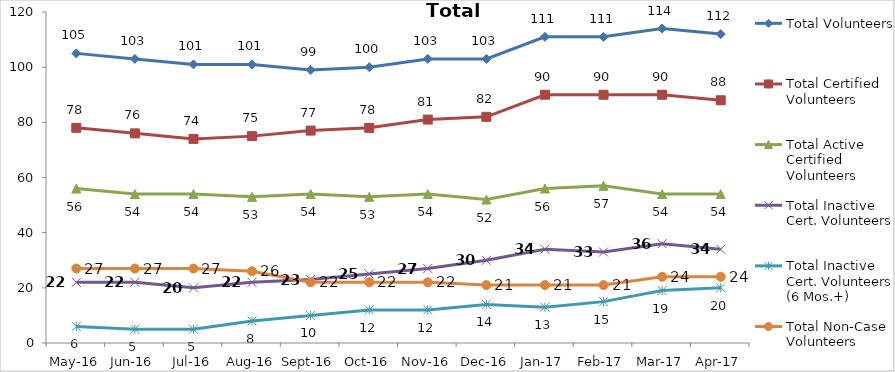
| Category | Total Volunteers | Total Certified Volunteers | Total Active Certified Volunteers | Total Inactive Cert. Volunteers | Total Inactive Cert. Volunteers (6 Mos.+) | Total Non-Case Volunteers |
|---|---|---|---|---|---|---|
| May-16 | 105 | 78 | 56 | 22 | 6 | 27 |
| Jun-16 | 103 | 76 | 54 | 22 | 5 | 27 |
| Jul-16 | 101 | 74 | 54 | 20 | 5 | 27 |
| Aug-16 | 101 | 75 | 53 | 22 | 8 | 26 |
| Sep-16 | 99 | 77 | 54 | 23 | 10 | 22 |
| Oct-16 | 100 | 78 | 53 | 25 | 12 | 22 |
| Nov-16 | 103 | 81 | 54 | 27 | 12 | 22 |
| Dec-16 | 103 | 82 | 52 | 30 | 14 | 21 |
| Jan-17 | 111 | 90 | 56 | 34 | 13 | 21 |
| Feb-17 | 111 | 90 | 57 | 33 | 15 | 21 |
| Mar-17 | 114 | 90 | 54 | 36 | 19 | 24 |
| Apr-17 | 112 | 88 | 54 | 34 | 20 | 24 |